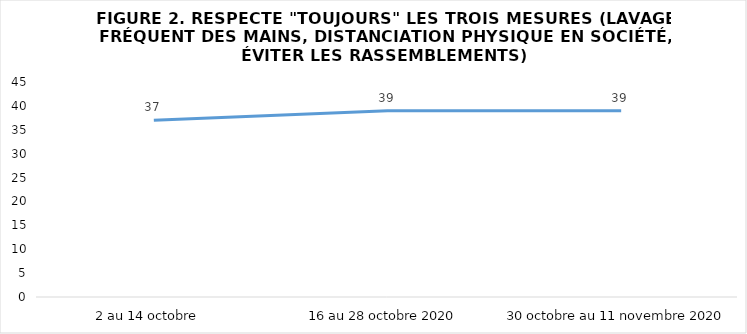
| Category | Series 0 |
|---|---|
| 2 au 14 octobre  | 37 |
| 16 au 28 octobre 2020 | 39 |
| 30 octobre au 11 novembre 2020 | 39 |